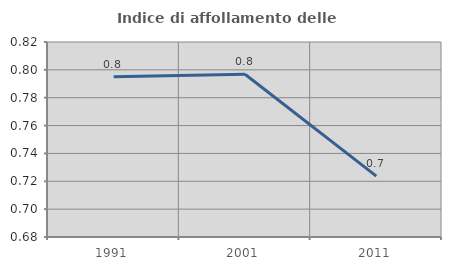
| Category | Indice di affollamento delle abitazioni  |
|---|---|
| 1991.0 | 0.795 |
| 2001.0 | 0.797 |
| 2011.0 | 0.724 |